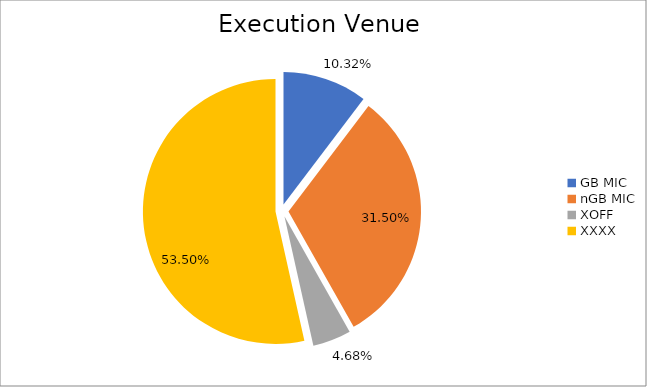
| Category | Series 0 |
|---|---|
| GB MIC | 919196.37 |
| nGB MIC | 2806530.37 |
| XOFF | 417157.816 |
| XXXX | 4766430.371 |